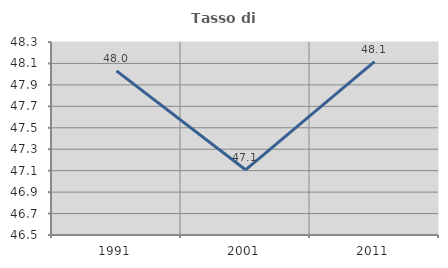
| Category | Tasso di occupazione   |
|---|---|
| 1991.0 | 48.03 |
| 2001.0 | 47.108 |
| 2011.0 | 48.117 |